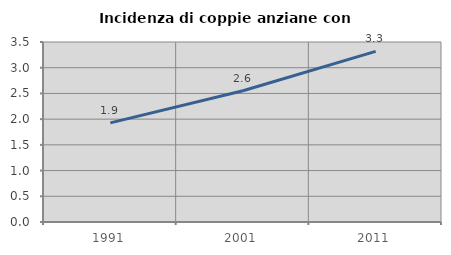
| Category | Incidenza di coppie anziane con figli |
|---|---|
| 1991.0 | 1.928 |
| 2001.0 | 2.553 |
| 2011.0 | 3.318 |